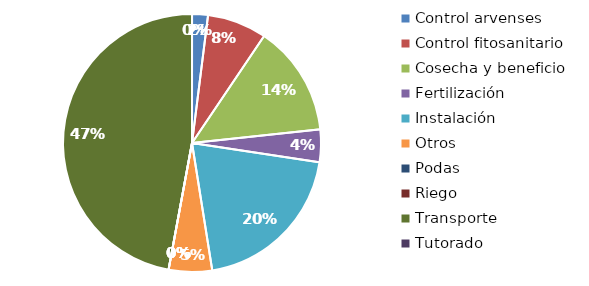
| Category | Valor |
|---|---|
| Control arvenses | 22917 |
| Control fitosanitario | 85816 |
| Cosecha y beneficio | 159856 |
| Fertilización | 46875 |
| Instalación | 231609 |
| Otros | 62500 |
| Podas | 0 |
| Riego | 0 |
| Transporte | 542470 |
| Tutorado | 0 |